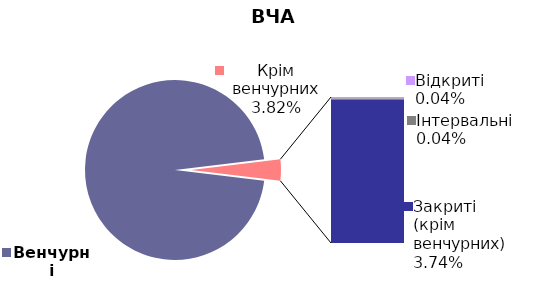
| Category | 30.06.2018 |
|---|---|
| Венчурні | 0.962 |
| Відкриті | 0 |
| Інтервальні | 0 |
| Закриті (крім венчурних) | 0.037 |